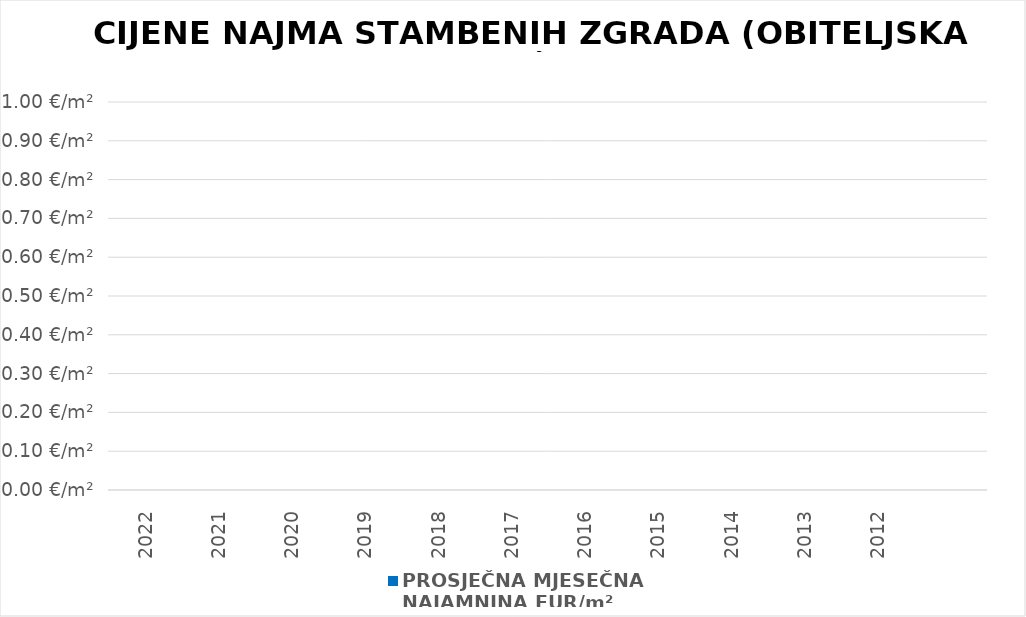
| Category | PROSJEČNA MJESEČNA 
NAJAMNINA EUR/m² |
|---|---|
| 2022 | 0 |
| 2021 | 0 |
| 2020 | 0 |
| 2019 | 0 |
| 2018 | 0 |
| 2017 | 0 |
| 2016 | 0 |
| 2015 | 0 |
| 2014 | 0 |
| 2013 | 0 |
| 2012 | 0 |